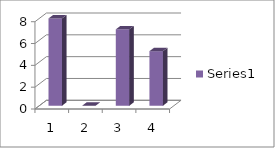
| Category | Series 0 |
|---|---|
| 0 | 8 |
| 1 | 0 |
| 2 | 7 |
| 3 | 5 |